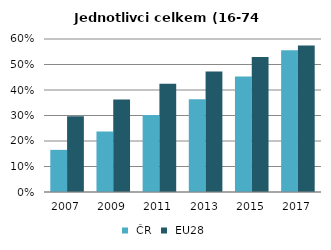
| Category |  ČR |  EU28 |
|---|---|---|
| 2007.0 | 0.165 | 0.297 |
| 2009.0 | 0.237 | 0.363 |
| 2011.0 | 0.302 | 0.424 |
| 2013.0 | 0.364 | 0.472 |
| 2015.0 | 0.453 | 0.53 |
| 2017.0 | 0.556 | 0.575 |